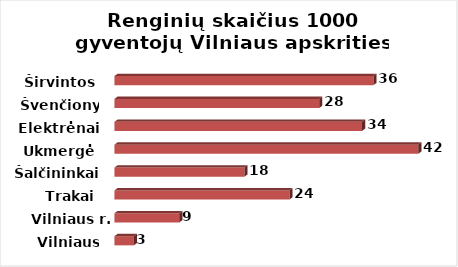
| Category | Series 0 |
|---|---|
| Vilniaus m. | 2.697 |
| Vilniaus r. | 9.027 |
| Trakai | 24.339 |
| Šalčininkai | 18.086 |
| Ukmergė | 42.262 |
| Elektrėnai | 34.44 |
| Švenčionys | 28.479 |
| Širvintos | 36.027 |